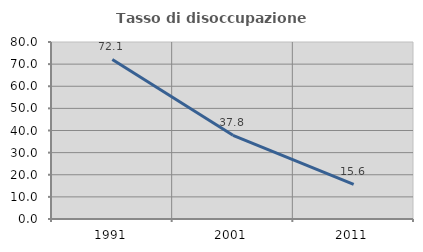
| Category | Tasso di disoccupazione giovanile  |
|---|---|
| 1991.0 | 72.115 |
| 2001.0 | 37.838 |
| 2011.0 | 15.625 |